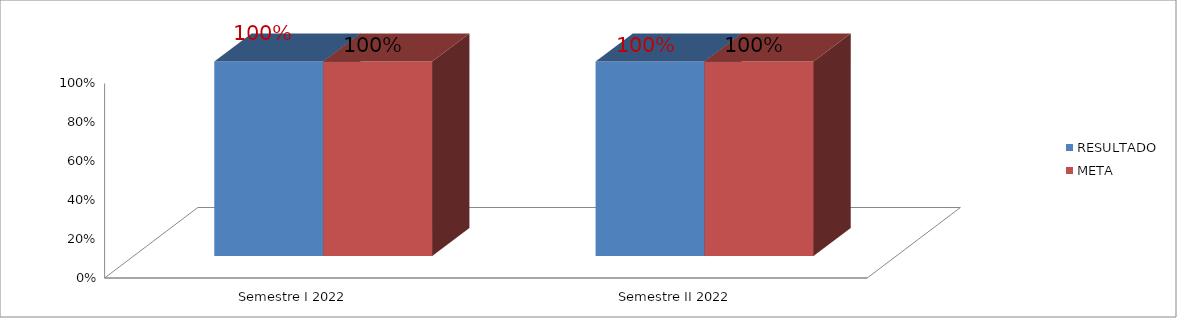
| Category | RESULTADO | META |
|---|---|---|
| Semestre I 2022 | 1 | 1 |
| Semestre II 2022 | 1 | 1 |